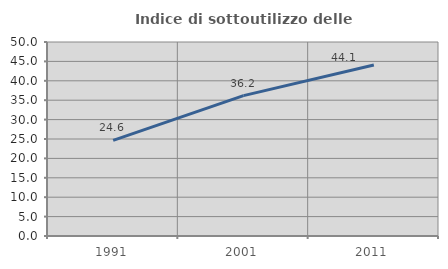
| Category | Indice di sottoutilizzo delle abitazioni  |
|---|---|
| 1991.0 | 24.632 |
| 2001.0 | 36.186 |
| 2011.0 | 44.074 |